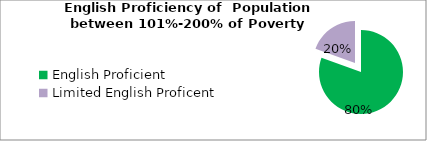
| Category | Percent |
|---|---|
| English Proficient | 0.805 |
| Limited English Proficent | 0.195 |